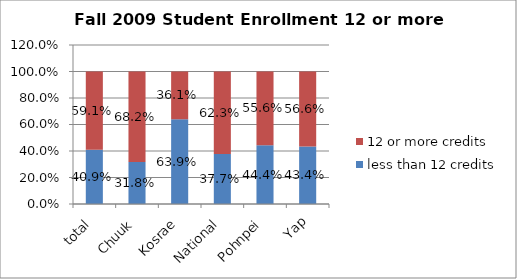
| Category | less than 12 credits | 12 or more credits |
|---|---|---|
| total | 0.409 | 0.591 |
| Chuuk | 0.318 | 0.682 |
| Kosrae | 0.639 | 0.361 |
| National | 0.377 | 0.623 |
| Pohnpei | 0.444 | 0.556 |
| Yap | 0.434 | 0.566 |